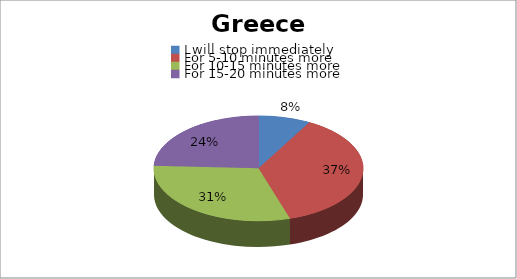
| Category | Series 0 |
|---|---|
| I will stop immediately | 5 |
| For 5-10 minutes more | 23 |
| For 10-15 minutes more | 19 |
| For 15-20 minutes more  | 15 |